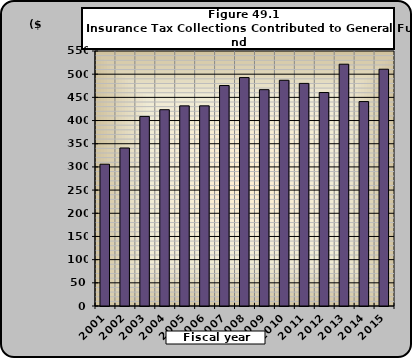
| Category | Amount of Insurance Tax Collections to General Fund |
|---|---|
| 2001.0 | 305791330.6 |
| 2002.0 | 340785358.35 |
| 2003.0 | 408873354.76 |
| 2004.0 | 423405049.66 |
| 2005.0 | 431664201.7 |
| 2006.0 | 431729294.87 |
| 2007.0 | 475545412.57 |
| 2008.0 | 492698607.38 |
| 2009.0 | 466601944.77 |
| 2010.0 | 486848659.69 |
| 2011.0 | 480134607.97 |
| 2012.0 | 460440591.87 |
| 2013.0 | 521509350.52 |
| 2014.0 | 440922113.59 |
| 2015.0 | 510676294.38 |